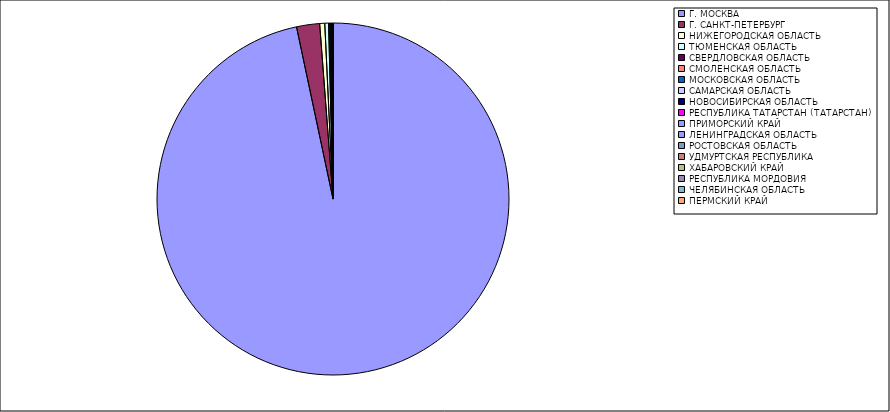
| Category | Оборот |
|---|---|
| Г. МОСКВА | 96.621 |
| Г. САНКТ-ПЕТЕРБУРГ | 2.116 |
| НИЖЕГОРОДСКАЯ ОБЛАСТЬ | 0.463 |
| ТЮМЕНСКАЯ ОБЛАСТЬ | 0.348 |
| СВЕРДЛОВСКАЯ ОБЛАСТЬ | 0.108 |
| СМОЛЕНСКАЯ ОБЛАСТЬ | 0.076 |
| МОСКОВСКАЯ ОБЛАСТЬ | 0.044 |
| САМАРСКАЯ ОБЛАСТЬ | 0.038 |
| НОВОСИБИРСКАЯ ОБЛАСТЬ | 0.026 |
| РЕСПУБЛИКА ТАТАРСТАН (ТАТАРСТАН) | 0.025 |
| ПРИМОРСКИЙ КРАЙ | 0.021 |
| ЛЕНИНГРАДСКАЯ ОБЛАСТЬ | 0.015 |
| РОСТОВСКАЯ ОБЛАСТЬ | 0.011 |
| УДМУРТСКАЯ РЕСПУБЛИКА | 0.011 |
| ХАБАРОВСКИЙ КРАЙ | 0.007 |
| РЕСПУБЛИКА МОРДОВИЯ | 0.005 |
| ЧЕЛЯБИНСКАЯ ОБЛАСТЬ | 0.005 |
| ПЕРМСКИЙ КРАЙ | 0.005 |